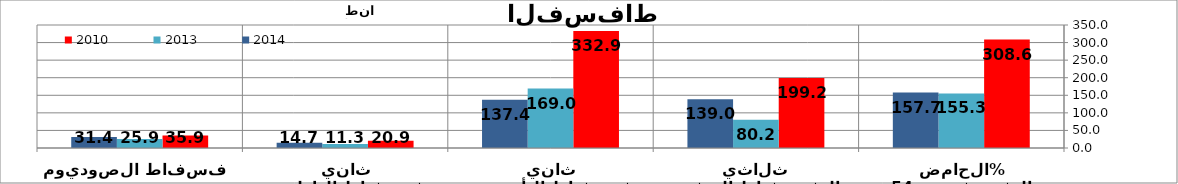
| Category | 2010 | 2013 | 2014 |
|---|---|---|---|
| الحامض الفسفوري 54% | 308.613 | 155.297 | 157.729 |
| ثلاثي الفسفاط الرفيع | 199.157 | 80.219 | 139.002 |
| ثاني فسفاط الأمونيا | 332.9 | 168.976 | 137.35 |
| ثاني فسفاط الكلس | 20.88 | 11.33 | 14.67 |
| فسفاط الصوديوم  | 35.86 | 25.914 | 31.425 |